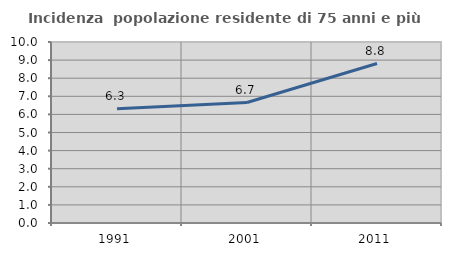
| Category | Incidenza  popolazione residente di 75 anni e più |
|---|---|
| 1991.0 | 6.306 |
| 2001.0 | 6.657 |
| 2011.0 | 8.809 |